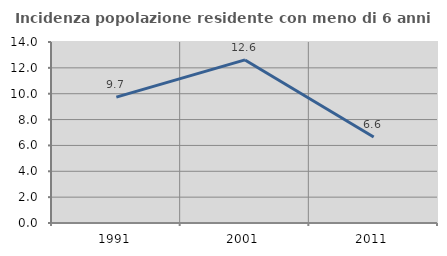
| Category | Incidenza popolazione residente con meno di 6 anni |
|---|---|
| 1991.0 | 9.737 |
| 2001.0 | 12.614 |
| 2011.0 | 6.647 |